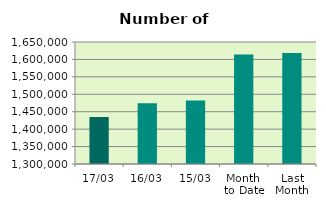
| Category | Series 0 |
|---|---|
| 17/03 | 1434790 |
| 16/03 | 1474268 |
| 15/03 | 1482092 |
| Month 
to Date | 1614264.769 |
| Last
Month | 1618522.4 |